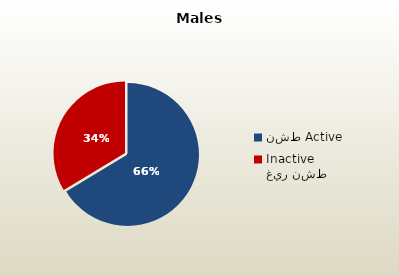
| Category | الذكور القطريين  Qatari Males |
|---|---|
| نشط Active | 70623 |
| غير نشط Inactive | 35784 |